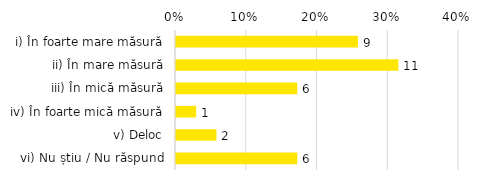
| Category | Total |
|---|---|
| i) În foarte mare măsură | 0.257 |
| ii) În mare măsură | 0.314 |
| iii) În mică măsură | 0.171 |
| iv) În foarte mică măsură | 0.029 |
| v) Deloc | 0.057 |
| vi) Nu știu / Nu răspund | 0.171 |